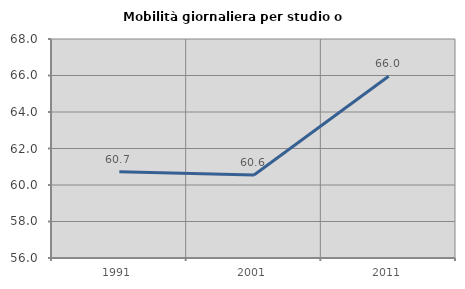
| Category | Mobilità giornaliera per studio o lavoro |
|---|---|
| 1991.0 | 60.726 |
| 2001.0 | 60.552 |
| 2011.0 | 65.959 |